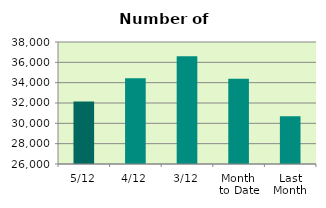
| Category | Series 0 |
|---|---|
| 5/12 | 32152 |
| 4/12 | 34436 |
| 3/12 | 36604 |
| Month 
to Date | 34397.333 |
| Last
Month | 30687.818 |